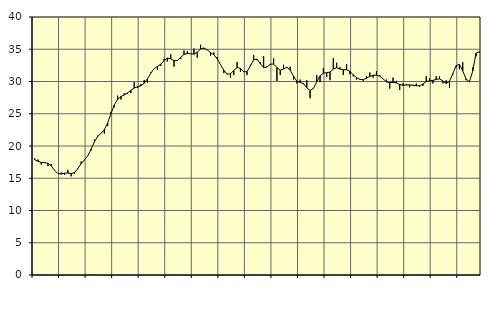
| Category | Piggar | Series 1 |
|---|---|---|
| nan | 18.1 | 17.86 |
| 87.0 | 17.9 | 17.64 |
| 87.0 | 17.1 | 17.45 |
| 87.0 | 17.5 | 17.41 |
| nan | 16.9 | 17.32 |
| 88.0 | 17.2 | 16.9 |
| 88.0 | 16.2 | 16.24 |
| 88.0 | 15.7 | 15.72 |
| nan | 15.9 | 15.65 |
| 89.0 | 15.5 | 15.79 |
| 89.0 | 16.3 | 15.81 |
| 89.0 | 15.3 | 15.72 |
| nan | 15.7 | 15.88 |
| 90.0 | 16.4 | 16.51 |
| 90.0 | 17.6 | 17.27 |
| 90.0 | 17.8 | 17.83 |
| nan | 18.5 | 18.47 |
| 91.0 | 19.3 | 19.49 |
| 91.0 | 21 | 20.65 |
| 91.0 | 21.6 | 21.49 |
| nan | 21.9 | 21.95 |
| 92.0 | 21.9 | 22.53 |
| 92.0 | 23.1 | 23.57 |
| 92.0 | 25.3 | 25.01 |
| nan | 26 | 26.38 |
| 93.0 | 27.8 | 27.22 |
| 93.0 | 27.2 | 27.68 |
| 93.0 | 28.2 | 27.91 |
| nan | 28.1 | 28.23 |
| 94.0 | 28.2 | 28.65 |
| 94.0 | 29.9 | 28.98 |
| 94.0 | 29 | 29.2 |
| nan | 29.6 | 29.33 |
| 95.0 | 30.2 | 29.72 |
| 95.0 | 29.8 | 30.42 |
| 95.0 | 31.4 | 31.3 |
| nan | 32 | 31.98 |
| 96.0 | 31.8 | 32.34 |
| 96.0 | 32.4 | 32.68 |
| 96.0 | 33.5 | 33.22 |
| nan | 33.1 | 33.62 |
| 97.0 | 34.2 | 33.52 |
| 97.0 | 32.3 | 33.22 |
| 97.0 | 33.3 | 33.26 |
| nan | 33.5 | 33.74 |
| 98.0 | 34.8 | 34.2 |
| 98.0 | 34.7 | 34.36 |
| 98.0 | 34.3 | 34.3 |
| nan | 35.1 | 34.24 |
| 99.0 | 33.7 | 34.55 |
| 99.0 | 35.7 | 35.04 |
| 99.0 | 35.1 | 35.2 |
| nan | 34.9 | 34.9 |
| 0.0 | 34 | 34.47 |
| 0.0 | 34.5 | 34.15 |
| 0.0 | 33.8 | 33.52 |
| nan | 32.6 | 32.63 |
| 1.0 | 31.3 | 31.75 |
| 1.0 | 31.2 | 31.14 |
| 1.0 | 30.6 | 31.18 |
| nan | 31 | 31.72 |
| 2.0 | 33 | 32.18 |
| 2.0 | 31.5 | 32.04 |
| 2.0 | 31.6 | 31.5 |
| nan | 31 | 31.54 |
| 3.0 | 32.6 | 32.41 |
| 3.0 | 34.1 | 33.35 |
| 3.0 | 33.3 | 33.47 |
| nan | 33 | 32.77 |
| 4.0 | 33.9 | 32.16 |
| 4.0 | 32.3 | 32.24 |
| 4.0 | 32.6 | 32.69 |
| nan | 33.6 | 32.7 |
| 5.0 | 30.1 | 32.17 |
| 5.0 | 31 | 31.75 |
| 5.0 | 32.6 | 31.94 |
| nan | 32.1 | 32.21 |
| 6.0 | 32.3 | 31.76 |
| 6.0 | 30.3 | 30.84 |
| 6.0 | 29.7 | 30.05 |
| nan | 30.3 | 29.86 |
| 7.0 | 29.6 | 29.67 |
| 7.0 | 30.2 | 29.02 |
| 7.0 | 27.4 | 28.61 |
| nan | 28.9 | 28.94 |
| 8.0 | 31 | 29.94 |
| 8.0 | 29.9 | 30.87 |
| 8.0 | 32.1 | 31.3 |
| nan | 30.7 | 31.36 |
| 9.0 | 30.2 | 31.47 |
| 9.0 | 33.6 | 31.92 |
| 9.0 | 32.9 | 32.13 |
| nan | 32.2 | 31.93 |
| 10.0 | 31 | 31.81 |
| 10.0 | 32.7 | 31.82 |
| 10.0 | 31.1 | 31.59 |
| nan | 30.8 | 31.04 |
| 11.0 | 30.3 | 30.59 |
| 11.0 | 30.3 | 30.33 |
| 11.0 | 30.1 | 30.29 |
| nan | 30.8 | 30.52 |
| 12.0 | 31.4 | 30.78 |
| 12.0 | 30.6 | 30.98 |
| 12.0 | 31.6 | 30.98 |
| nan | 31 | 30.83 |
| 13.0 | 30.4 | 30.41 |
| 13.0 | 30.3 | 29.93 |
| 13.0 | 28.9 | 29.83 |
| nan | 30.6 | 29.87 |
| 14.0 | 30.1 | 29.77 |
| 14.0 | 28.7 | 29.55 |
| 14.0 | 29.7 | 29.41 |
| nan | 29.6 | 29.45 |
| 15.0 | 29.1 | 29.48 |
| 15.0 | 29.3 | 29.43 |
| 15.0 | 29.7 | 29.35 |
| nan | 29.2 | 29.33 |
| 16.0 | 29.3 | 29.61 |
| 16.0 | 30.8 | 29.98 |
| 16.0 | 30.5 | 30.1 |
| nan | 29.7 | 30.17 |
| 17.0 | 30.8 | 30.32 |
| 17.0 | 30.8 | 30.41 |
| 17.0 | 29.7 | 30.1 |
| nan | 30.2 | 29.69 |
| 18.0 | 29 | 30.04 |
| 18.0 | 31 | 31.21 |
| 18.0 | 32.2 | 32.44 |
| nan | 31.9 | 32.67 |
| 19.0 | 33 | 31.64 |
| 19.0 | 30.2 | 30.39 |
| 19.0 | 29.9 | 29.95 |
| nan | 32.2 | 31.6 |
| 20.0 | 33.9 | 34.4 |
| 20.0 | 34.5 | 34.61 |